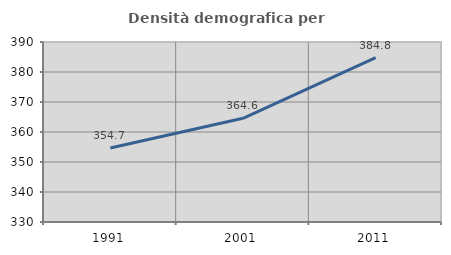
| Category | Densità demografica |
|---|---|
| 1991.0 | 354.691 |
| 2001.0 | 364.572 |
| 2011.0 | 384.783 |